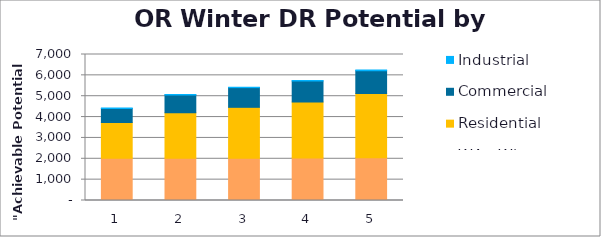
| Category | WA - Winter Potential |  Residential  |  Commercial  |  Industrial  |
|---|---|---|---|---|
| 0 | 2026 | 1711.274 | 679.024 | 16.291 |
| 1 | 2027 | 2180.617 | 851.359 | 17.948 |
| 2 | 2028 | 2439.889 | 943.005 | 18.97 |
| 3 | 2035 | 2692.79 | 1005.496 | 21.571 |
| 4 | 2045 | 3079.564 | 1102.018 | 25.915 |